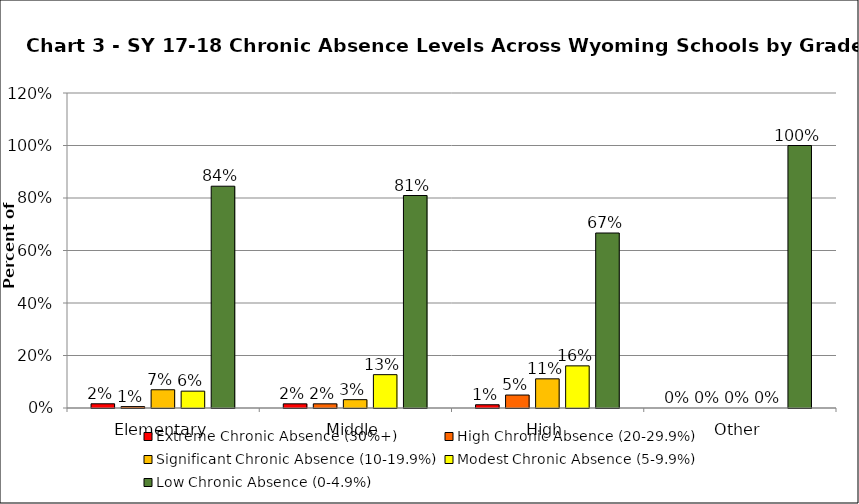
| Category | Extreme Chronic Absence (30%+) | High Chronic Absence (20-29.9%) | Significant Chronic Absence (10-19.9%) | Modest Chronic Absence (5-9.9%) | Low Chronic Absence (0-4.9%) |
|---|---|---|---|---|---|
| 0 | 0.016 | 0.005 | 0.07 | 0.064 | 0.845 |
| 1 | 0.016 | 0.016 | 0.032 | 0.127 | 0.81 |
| 2 | 0.012 | 0.049 | 0.111 | 0.16 | 0.667 |
| 3 | 0 | 0 | 0 | 0 | 1 |